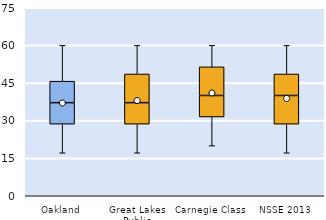
| Category | 25th | 50th | 75th |
|---|---|---|---|
| Oakland | 28.571 | 8.571 | 8.571 |
| Great Lakes Public | 28.571 | 8.571 | 11.429 |
| Carnegie Class | 31.429 | 8.571 | 11.429 |
| NSSE 2013 | 28.571 | 11.429 | 8.571 |